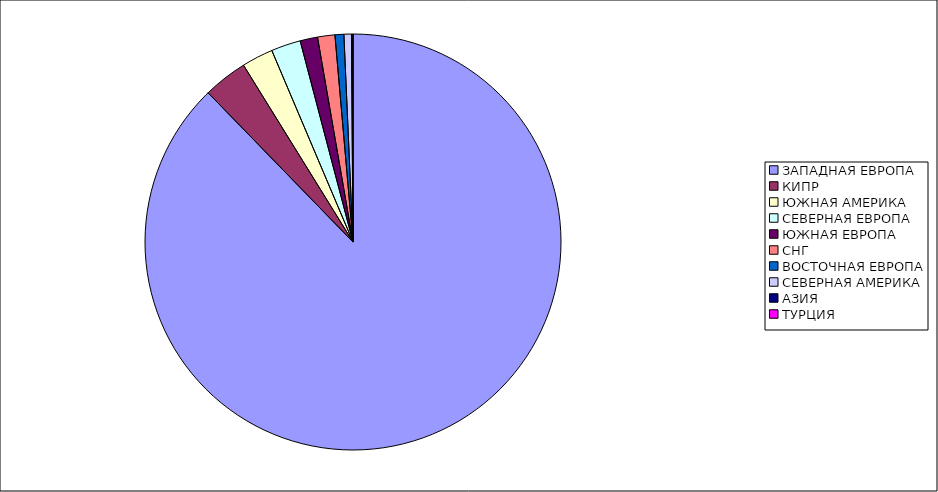
| Category | Оборот |
|---|---|
| ЗАПАДНАЯ ЕВРОПА | 0.877 |
| КИПР | 0.034 |
| ЮЖНАЯ АМЕРИКА | 0.024 |
| СЕВЕРНАЯ ЕВРОПА | 0.023 |
| ЮЖНАЯ ЕВРОПА | 0.014 |
| СНГ | 0.013 |
| ВОСТОЧНАЯ ЕВРОПА | 0.007 |
| СЕВЕРНАЯ АМЕРИКА | 0.006 |
| АЗИЯ | 0.001 |
| ТУРЦИЯ | 0 |